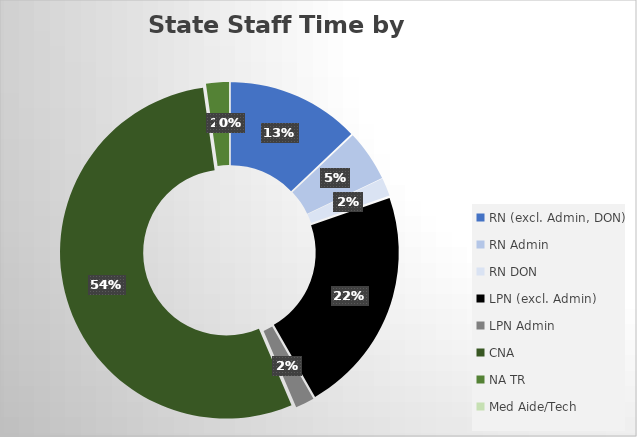
| Category | Series 0 |
|---|---|
| RN (excl. Admin, DON) | 15802 |
| RN Admin | 6113.189 |
| RN DON | 2171.919 |
| LPN (excl. Admin) | 27020.903 |
| LPN Admin | 2260.856 |
| CNA | 66343.016 |
| NA TR | 2710.958 |
| Med Aide/Tech | 34.463 |